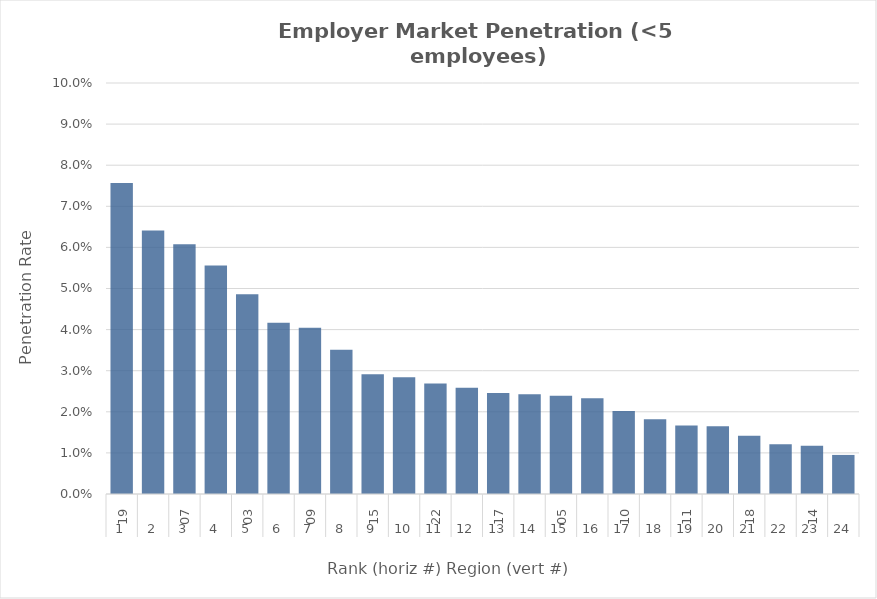
| Category | Rate |
|---|---|
| 0 | 0.076 |
| 1 | 0.064 |
| 2 | 0.061 |
| 3 | 0.056 |
| 4 | 0.049 |
| 5 | 0.042 |
| 6 | 0.04 |
| 7 | 0.035 |
| 8 | 0.029 |
| 9 | 0.028 |
| 10 | 0.027 |
| 11 | 0.026 |
| 12 | 0.025 |
| 13 | 0.024 |
| 14 | 0.024 |
| 15 | 0.023 |
| 16 | 0.02 |
| 17 | 0.018 |
| 18 | 0.017 |
| 19 | 0.016 |
| 20 | 0.014 |
| 21 | 0.012 |
| 22 | 0.012 |
| 23 | 0.01 |